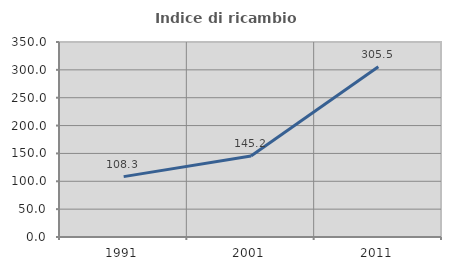
| Category | Indice di ricambio occupazionale  |
|---|---|
| 1991.0 | 108.333 |
| 2001.0 | 145.245 |
| 2011.0 | 305.53 |